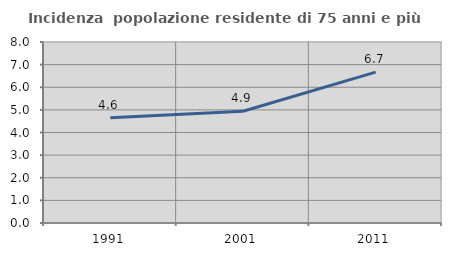
| Category | Incidenza  popolazione residente di 75 anni e più |
|---|---|
| 1991.0 | 4.65 |
| 2001.0 | 4.94 |
| 2011.0 | 6.67 |